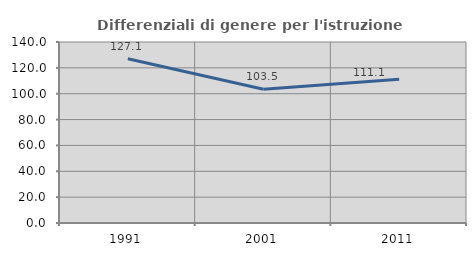
| Category | Differenziali di genere per l'istruzione superiore |
|---|---|
| 1991.0 | 127.098 |
| 2001.0 | 103.468 |
| 2011.0 | 111.105 |